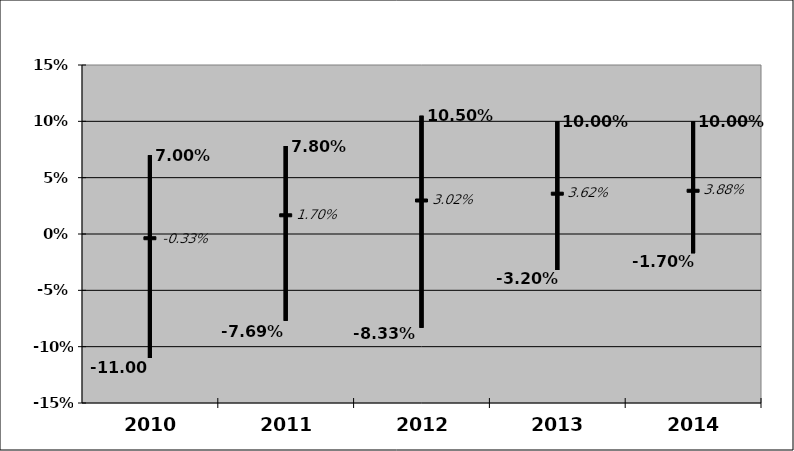
| Category | Series 0 | Series 1 | Series 2 |
|---|---|---|---|
| 2010-12-01 | 0.07 | -0.11 | -0.003 |
| 2011-12-01 | 0.078 | -0.077 | 0.017 |
| 2012-12-01 | 0.105 | -0.083 | 0.03 |
| 2013-12-01 | 0.1 | -0.032 | 0.036 |
| 2014-12-01 | 0.1 | -0.017 | 0.039 |